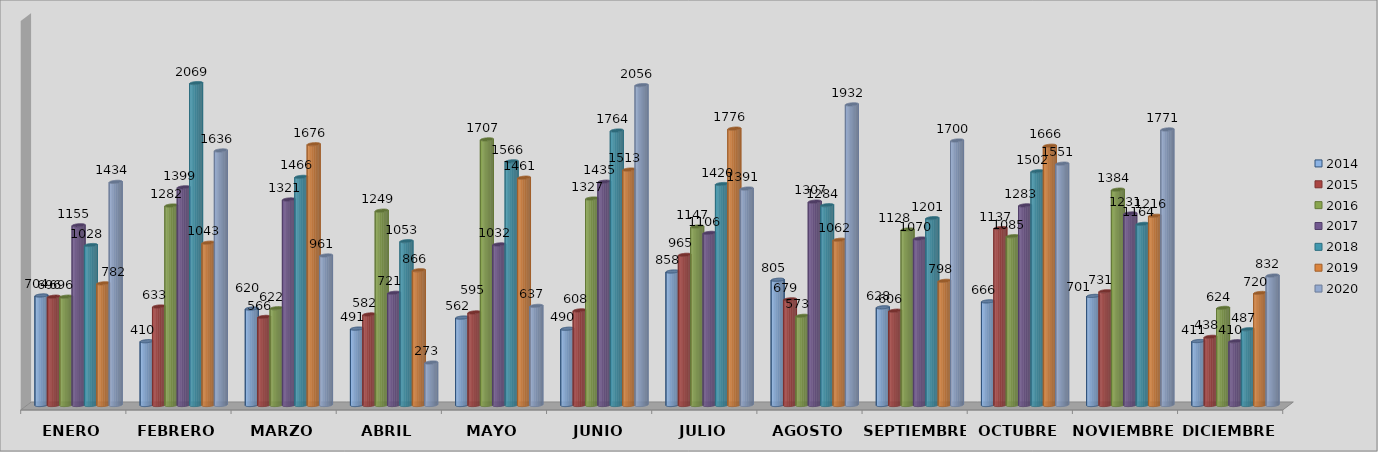
| Category | 2014 | 2015 | 2016 | 2017 | 2018 | 2019 | 2020 |
|---|---|---|---|---|---|---|---|
| ENERO | 704 | 696 | 696 | 1155 | 1028 | 782 | 1434 |
| FEBRERO | 410 | 633 | 1282 | 1399 | 2069 | 1043 | 1636 |
| MARZO | 620 | 566 | 622 | 1321 | 1466 | 1676 | 961 |
| ABRIL | 491 | 582 | 1249 | 721 | 1053 | 866 | 273 |
| MAYO | 562 | 595 | 1707 | 1032 | 1566 | 1461 | 637 |
| JUNIO | 490 | 608 | 1327 | 1435 | 1764 | 1513 | 2056 |
| JULIO | 858 | 965 | 1147 | 1106 | 1420 | 1776 | 1391 |
| AGOSTO | 805 | 679 | 573 | 1307 | 1284 | 1062 | 1932 |
| SEPTIEMBRE | 628 | 606 | 1128 | 1070 | 1201 | 798 | 1700 |
| OCTUBRE | 666 | 1137 | 1085 | 1283 | 1502 | 1666 | 1551 |
| NOVIEMBRE | 701 | 731 | 1384 | 1231 | 1164 | 1216 | 1771 |
| DICIEMBRE | 411 | 438 | 624 | 410 | 487 | 720 | 832 |